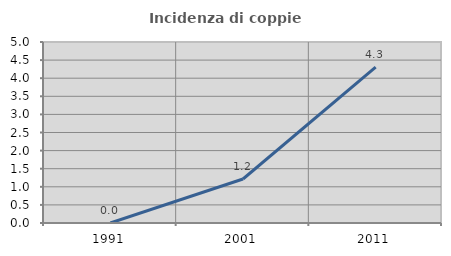
| Category | Incidenza di coppie miste |
|---|---|
| 1991.0 | 0 |
| 2001.0 | 1.216 |
| 2011.0 | 4.308 |